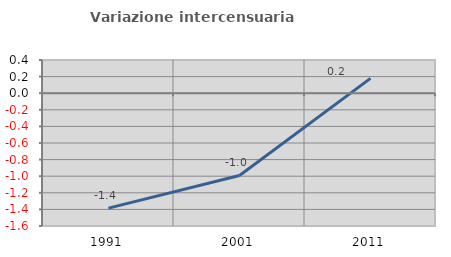
| Category | Variazione intercensuaria annua |
|---|---|
| 1991.0 | -1.385 |
| 2001.0 | -0.991 |
| 2011.0 | 0.179 |